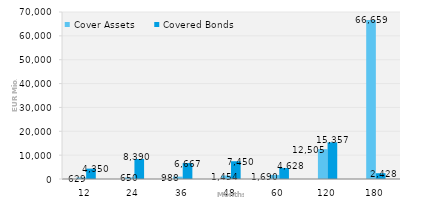
| Category | Cover Assets | Covered Bonds |
|---|---|---|
| 12.0 | 628.553 | 4350 |
| 24.0 | 650.389 | 8390 |
| 36.0 | 988.405 | 6667.222 |
| 48.0 | 1454 | 7450 |
| 60.0 | 1689.88 | 4628.205 |
| 120.0 | 12504.921 | 15357.448 |
| 180.0 | 66659.15 | 2427.8 |